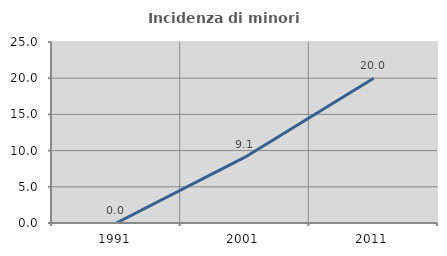
| Category | Incidenza di minori stranieri |
|---|---|
| 1991.0 | 0 |
| 2001.0 | 9.091 |
| 2011.0 | 20 |